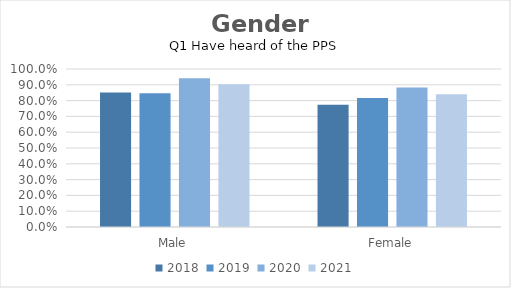
| Category | 2018 | 2019 | 2020 | 2021 |
|---|---|---|---|---|
| Male | 0.852 | 0.847 | 0.942 | 0.903 |
| Female | 0.774 | 0.817 | 0.883 | 0.84 |